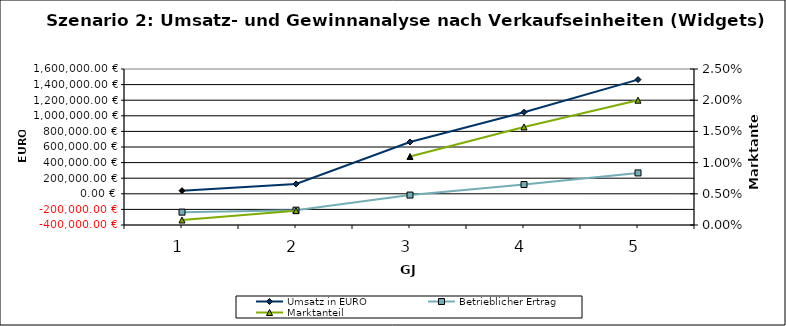
| Category | Umsatz in EURO | Betrieblicher Ertrag |
|---|---|---|
| 0 | 40000 | -235000 |
| 1 | 126474.463 | -210072.076 |
| 2 | 663990.93 | -16228.401 |
| 3 | 1045785.714 | 118987.893 |
| 4 | 1464100 | 267660.298 |